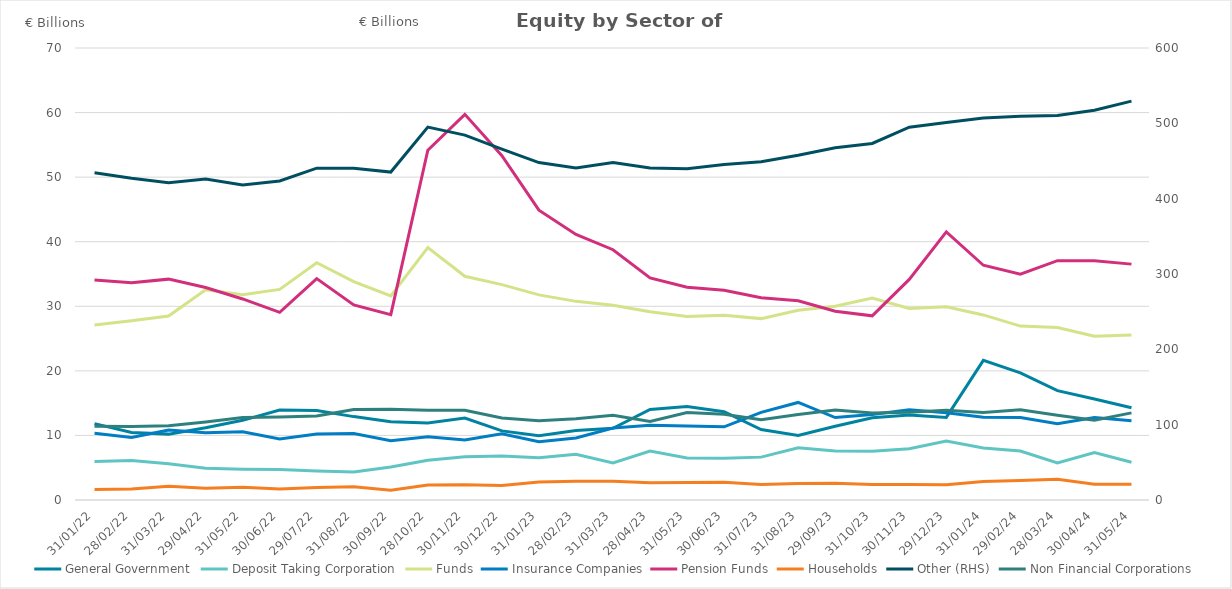
| Category | General Government | Deposit Taking Corporation | Funds | Insurance Companies | Pension Funds | Households |
|---|---|---|---|---|---|---|
| 2022-01-31 | 11.83 | 5.979 | 27.104 | 10.339 | 34.076 | 1.641 |
| 2022-02-28 | 10.462 | 6.126 | 27.762 | 9.668 | 33.63 | 1.717 |
| 2022-03-31 | 10.202 | 5.627 | 28.481 | 10.836 | 34.204 | 2.145 |
| 2022-04-29 | 11.185 | 4.919 | 32.57 | 10.408 | 32.918 | 1.813 |
| 2022-05-31 | 12.338 | 4.769 | 31.799 | 10.557 | 31.137 | 1.987 |
| 2022-06-30 | 13.939 | 4.742 | 32.614 | 9.465 | 29.053 | 1.713 |
| 2022-07-29 | 13.855 | 4.501 | 36.745 | 10.203 | 34.288 | 1.936 |
| 2022-08-31 | 12.915 | 4.338 | 33.822 | 10.296 | 30.219 | 2.051 |
| 2022-09-30 | 12.11 | 5.108 | 31.609 | 9.173 | 28.713 | 1.527 |
| 2022-10-28 | 11.933 | 6.139 | 39.096 | 9.785 | 54.166 | 2.317 |
| 2022-11-30 | 12.703 | 6.699 | 34.643 | 9.296 | 59.725 | 2.355 |
| 2022-12-30 | 10.702 | 6.826 | 33.354 | 10.238 | 53.309 | 2.245 |
| 2023-01-31 | 9.96 | 6.532 | 31.769 | 9.038 | 44.881 | 2.784 |
| 2023-02-28 | 10.751 | 7.083 | 30.764 | 9.604 | 41.117 | 2.905 |
| 2023-03-31 | 11.116 | 5.732 | 30.16 | 11.158 | 38.761 | 2.921 |
| 2023-04-28 | 14.019 | 7.587 | 29.146 | 11.566 | 34.389 | 2.668 |
| 2023-05-31 | 14.493 | 6.498 | 28.416 | 11.451 | 32.958 | 2.706 |
| 2023-06-30 | 13.667 | 6.448 | 28.62 | 11.331 | 32.478 | 2.751 |
| 2023-07-31 | 10.921 | 6.639 | 28.091 | 13.579 | 31.31 | 2.386 |
| 2023-08-31 | 10.007 | 8.09 | 29.391 | 15.107 | 30.857 | 2.541 |
| 2023-09-29 | 11.424 | 7.586 | 30.014 | 12.768 | 29.241 | 2.605 |
| 2023-10-31 | 12.743 | 7.569 | 31.289 | 13.229 | 28.523 | 2.415 |
| 2023-11-30 | 13.168 | 7.946 | 29.654 | 13.97 | 34.162 | 2.415 |
| 2023-12-29 | 12.786 | 9.134 | 29.925 | 13.528 | 41.516 | 2.345 |
| 2024-01-31 | 21.623 | 8.055 | 28.664 | 12.813 | 36.356 | 2.876 |
| 2024-02-29 | 19.686 | 7.583 | 26.935 | 12.758 | 34.987 | 3.011 |
| 2024-03-28 | 16.932 | 5.749 | 26.698 | 11.797 | 37.069 | 3.23 |
| 2024-04-30 | 15.643 | 7.351 | 25.371 | 12.771 | 37.042 | 2.44 |
| 2024-05-31 | 14.284 | 5.852 | 25.54 | 12.264 | 36.528 | 2.433 |